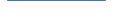
| Category | Series 0 |
|---|---|
| 0 | 119 |
| 1 | 97 |
| 2 | 107 |
| 3 | 88 |
| 4 | 89 |
| 5 | 80 |
| 6 | 75 |
| 7 | 75 |
| 8 | 81 |